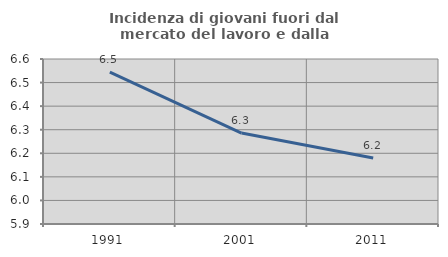
| Category | Incidenza di giovani fuori dal mercato del lavoro e dalla formazione  |
|---|---|
| 1991.0 | 6.544 |
| 2001.0 | 6.286 |
| 2011.0 | 6.18 |